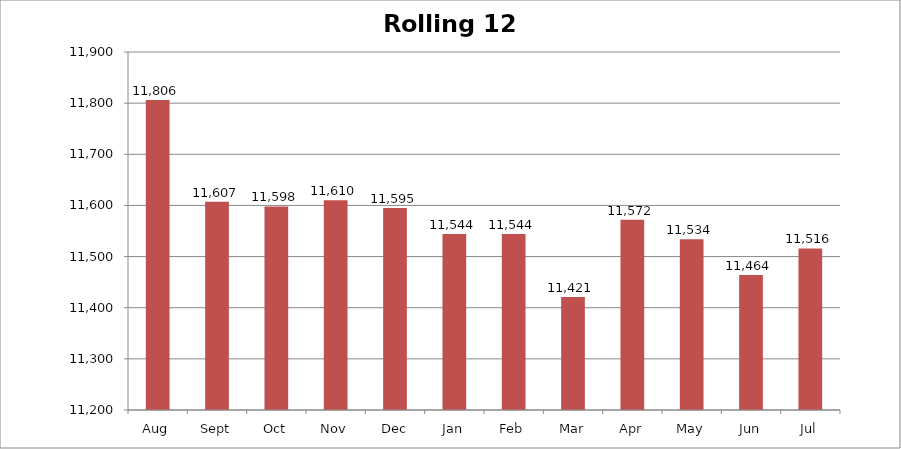
| Category | Rolling 12 Month |
|---|---|
| Aug | 11806 |
| Sept | 11607 |
| Oct | 11598 |
| Nov | 11610 |
| Dec | 11595 |
| Jan | 11544 |
| Feb | 11544 |
| Mar | 11421 |
| Apr | 11572 |
| May | 11534 |
| Jun | 11464 |
| Jul | 11516 |